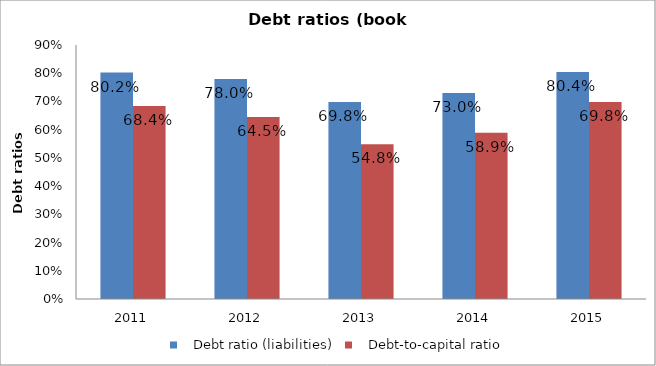
| Category |    Debt ratio (liabilities) |    Debt-to-capital ratio |
|---|---|---|
| 2011.0 | 0.802 | 0.684 |
| 2012.0 | 0.78 | 0.645 |
| 2013.0 | 0.698 | 0.548 |
| 2014.0 | 0.73 | 0.589 |
| 2015.0 | 0.804 | 0.698 |